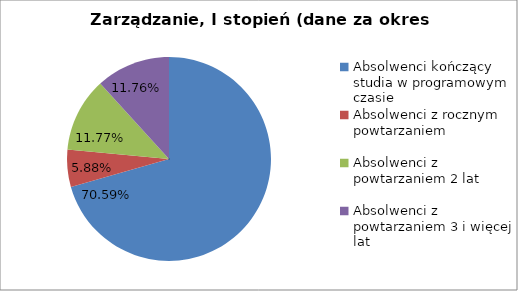
| Category | Series 0 |
|---|---|
| Absolwenci kończący studia w programowym czasie | 70.588 |
| Absolwenci z rocznym powtarzaniem | 5.882 |
| Absolwenci z powtarzaniem 2 lat | 11.765 |
| Absolwenci z powtarzaniem 3 i więcej lat | 11.765 |